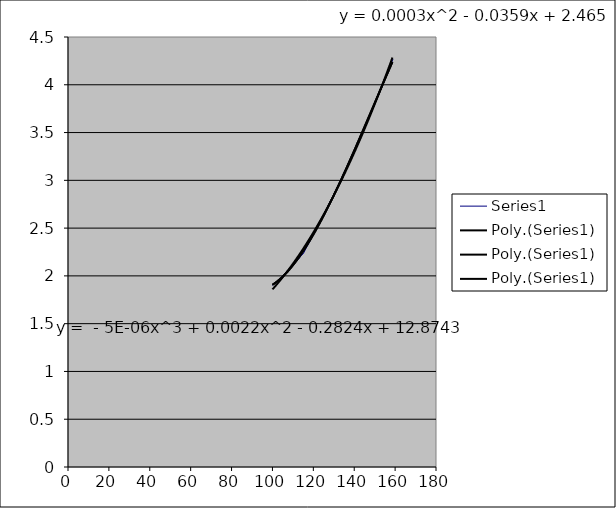
| Category | Series 0 |
|---|---|
| 100.0 | 1.9 |
| 101.0 | 1.92 |
| 102.0 | 1.94 |
| 103.0 | 1.96 |
| 104.0 | 1.98 |
| 105.0 | 2 |
| 106.0 | 2.02 |
| 107.0 | 2.05 |
| 108.0 | 2.07 |
| 109.0 | 2.09 |
| 110.0 | 2.11 |
| 111.0 | 2.14 |
| 112.0 | 2.16 |
| 113.0 | 2.18 |
| 114.0 | 2.21 |
| 115.0 | 2.23 |
| 116.0 | 2.27 |
| 117.0 | 2.31 |
| 118.0 | 2.35 |
| 119.0 | 2.39 |
| 120.0 | 2.43 |
| 121.0 | 2.47 |
| 122.0 | 2.51 |
| 123.0 | 2.55 |
| 124.0 | 2.6 |
| 125.0 | 2.64 |
| 126.0 | 2.68 |
| 127.0 | 2.72 |
| 128.0 | 2.77 |
| 129.0 | 2.81 |
| 130.0 | 2.85 |
| 131.0 | 2.9 |
| 132.0 | 2.94 |
| 133.0 | 2.99 |
| 134.0 | 3.03 |
| 135.0 | 3.08 |
| 136.0 | 3.12 |
| 137.0 | 3.17 |
| 138.0 | 3.22 |
| 139.0 | 3.26 |
| 140.0 | 3.31 |
| 141.0 | 3.36 |
| 142.0 | 3.41 |
| 143.0 | 3.45 |
| 144.0 | 3.5 |
| 145.0 | 3.55 |
| 146.0 | 3.6 |
| 147.0 | 3.65 |
| 148.0 | 3.7 |
| 149.0 | 3.75 |
| 150.0 | 3.8 |
| 151.0 | 3.85 |
| 152.0 | 3.9 |
| 153.0 | 3.95 |
| 154.0 | 4 |
| 155.0 | 4.06 |
| 156.0 | 4.11 |
| 157.0 | 4.16 |
| 158.0 | 4.22 |
| 159.0 | 4.27 |